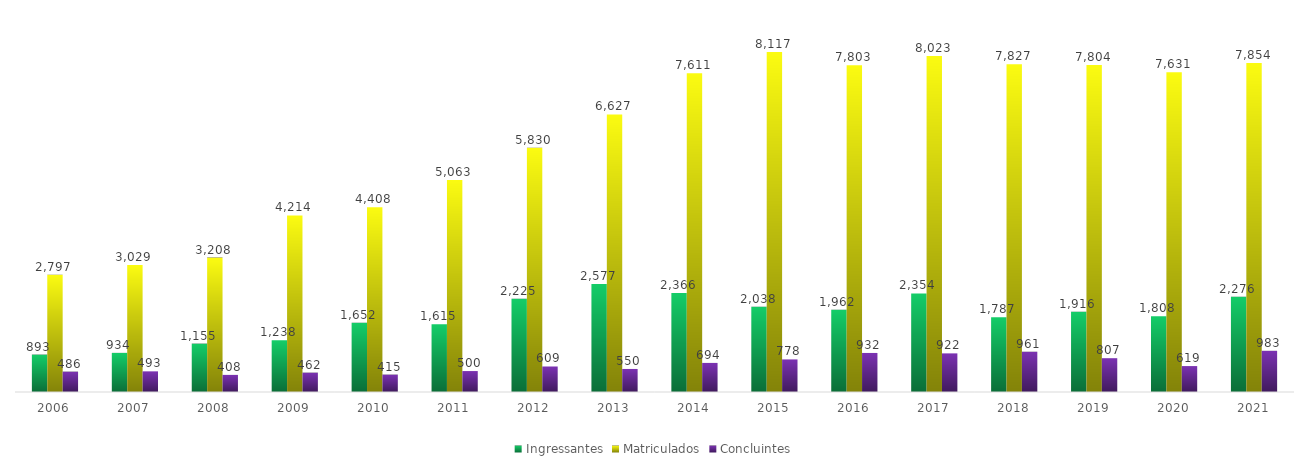
| Category | Ingressantes | Matriculados | Concluintes |
|---|---|---|---|
| 2006.0 | 893 | 2797 | 486 |
| 2007.0 | 934 | 3029 | 493 |
| 2008.0 | 1155 | 3208 | 408 |
| 2009.0 | 1238 | 4214 | 462 |
| 2010.0 | 1652 | 4408 | 415 |
| 2011.0 | 1615 | 5063 | 500 |
| 2012.0 | 2225 | 5830 | 609 |
| 2013.0 | 2577 | 6627 | 550 |
| 2014.0 | 2366 | 7611 | 694 |
| 2015.0 | 2038 | 8117 | 778 |
| 2016.0 | 1962 | 7803 | 932 |
| 2017.0 | 2354 | 8023 | 922 |
| 2018.0 | 1787 | 7827 | 961 |
| 2019.0 | 1916 | 7804 | 807 |
| 2020.0 | 1808 | 7631 | 619 |
| 2021.0 | 2276 | 7854 | 983 |